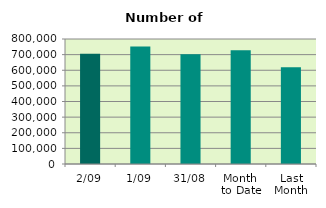
| Category | Series 0 |
|---|---|
| 2/09 | 705756 |
| 1/09 | 751316 |
| 31/08 | 702702 |
| Month 
to Date | 728536 |
| Last
Month | 618945.565 |